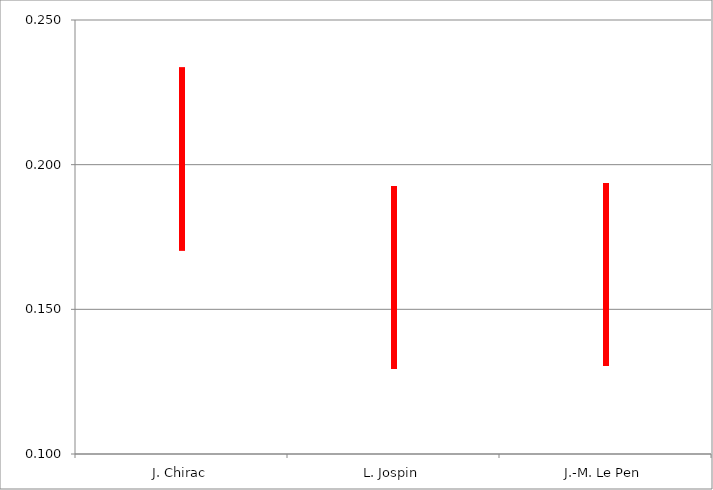
| Category | Series 0 | Series 1 | Series 2 |
|---|---|---|---|
| J. Chirac | 0.17 | 0.234 | 0.202 |
| L. Jospin | 0.129 | 0.193 | 0.161 |
| J.-M. Le Pen | 0.13 | 0.194 | 0.162 |